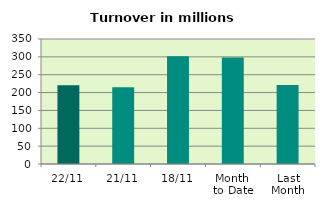
| Category | Series 0 |
|---|---|
| 22/11 | 220.673 |
| 21/11 | 215.143 |
| 18/11 | 301.9 |
| Month 
to Date | 297.916 |
| Last
Month | 221.516 |